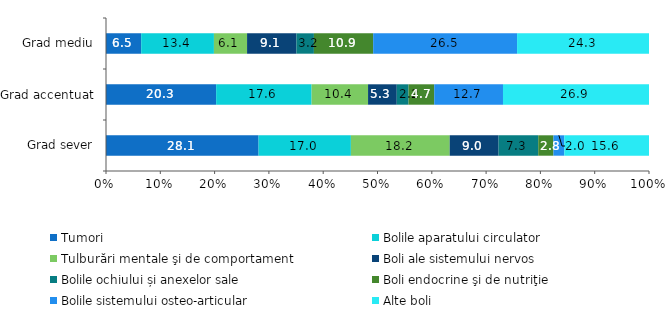
| Category | Tumori | Bolile aparatului circulator | Tulburări mentale şi de comportament | Boli ale sistemului nervos | Bolile ochiului și anexelor sale | Boli endocrine şi de nutriţie | Bolile sistemului osteo-articular | Alte boli  |
|---|---|---|---|---|---|---|---|---|
| Grad sever | 28.1 | 17 | 18.2 | 9 | 7.3 | 2.8 | 2 | 15.6 |
| Grad accentuat | 20.293 | 17.586 | 10.4 | 5.29 | 2.17 | 4.732 | 12.668 | 26.9 |
| Grad mediu | 6.481 | 13.4 | 6.105 | 9.095 | 3.22 | 10.914 | 26.511 | 24.3 |